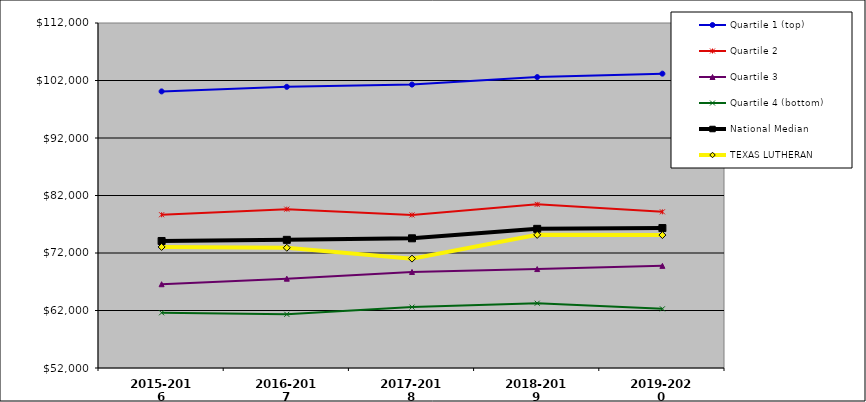
| Category | Quartile 1 (top) | Quartile 2 | Quartile 3 | Quartile 4 (bottom) | National Median | TEXAS LUTHERAN |
|---|---|---|---|---|---|---|
| 2015-2016 | 100102.5 | 78651 | 66568.5 | 61605 | 74088 | 73053 |
| 2016-2017 | 100899.5 | 79625.5 | 67533.5 | 61338.5 | 74288 | 72909 |
| 2017-2018 | 101292.5 | 78616 | 68705 | 62593.5 | 74555 | 71021 |
| 2018-2019 | 102594.5 | 80458.5 | 69205 | 63266 | 76199 | 75154 |
| 2019-2020 | 103189 | 79159.5 | 69761 | 62286.5 | 76337 | 75120 |